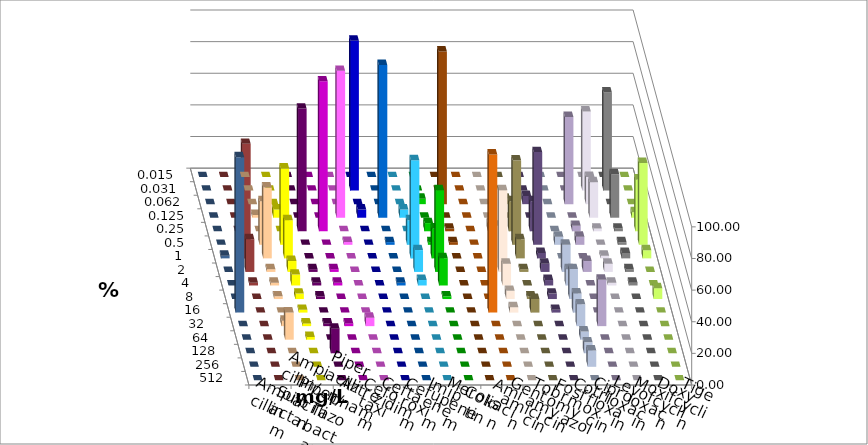
| Category | Ampicillin | Ampicillin/ Sulbactam | Piperacillin | Piperacillin/ Tazobactam | Aztreonam | Cefotaxim | Ceftazidim | Cefuroxim | Imipenem | Meropenem | Colistin | Amikacin | Gentamicin | Tobramycin | Fosfomycin | Cotrimoxazol | Ciprofloxacin | Levofloxacin | Moxifloxacin | Doxycyclin | Tigecyclin |
|---|---|---|---|---|---|---|---|---|---|---|---|---|---|---|---|---|---|---|---|---|---|
| 0.015 | 0 | 0 | 0 | 0 | 0 | 0 | 0 | 0 | 0 | 0 | 0 | 0 | 0 | 0 | 0 | 0 | 0 | 0 | 0 | 0 | 0 |
| 0.031 | 0 | 0 | 0 | 0 | 0 | 94.828 | 0 | 0 | 0 | 0 | 0 | 0 | 0 | 0 | 0 | 0 | 50 | 62.069 | 0 | 0 | 0 |
| 0.062 | 0 | 0 | 0 | 0 | 0 | 0 | 0 | 0 | 3.448 | 96.552 | 0 | 0 | 3.448 | 5.172 | 0 | 55.172 | 17.241 | 0 | 0 | 0 | 0 |
| 0.125 | 1.724 | 5.172 | 0 | 0 | 92.857 | 5.172 | 96.552 | 5.172 | 0 | 0 | 0 | 0 | 0 | 0 | 0 | 0 | 22.414 | 27.586 | 3.448 | 0 | 0 |
| 0.25 | 0 | 0 | 77.586 | 94.828 | 0 | 0 | 0 | 0 | 5.172 | 1.724 | 0 | 5.172 | 18.966 | 18.966 | 0 | 3.448 | 1.724 | 1.724 | 32.759 | 0 | 0 |
| 0.5 | 27.586 | 48.276 | 0 | 0 | 1.786 | 0 | 1.724 | 15.517 | 1.724 | 1.724 | 0 | 0 | 53.448 | 58.621 | 5.172 | 5.172 | 0 | 1.724 | 51.724 | 0 | 5.172 |
| 1.0 | 44.828 | 24.138 | 0 | 0 | 0 | 0 | 0 | 62.069 | 18.966 | 0 | 0 | 20.69 | 12.069 | 3.448 | 0 | 0 | 1.724 | 3.448 | 5.172 | 1.724 | 72.414 |
| 2.0 | 1.724 | 6.897 | 1.724 | 1.724 | 0 | 0 | 0 | 13.793 | 51.724 | 0 | 0 | 51.724 | 1.724 | 5.172 | 17.241 | 6.897 | 5.172 | 1.724 | 0 | 0 | 20.69 |
| 4.0 | 1.724 | 6.897 | 1.724 | 1.724 | 0 | 0 | 1.724 | 3.448 | 17.241 | 0 | 0 | 13.793 | 0 | 3.448 | 10.345 | 0 | 1.724 | 1.724 | 0 | 0 | 1.724 |
| 8.0 | 1.724 | 3.448 | 1.724 | 0 | 0 | 0 | 0 | 0 | 1.724 | 0 | 0 | 5.172 | 1.724 | 3.448 | 18.966 | 0 | 0 | 0 | 6.897 | 0 | 0 |
| 16.0 | 0 | 1.724 | 0 | 0 | 0 | 0 | 0 | 0 | 0 | 0 | 100 | 3.448 | 8.621 | 1.724 | 12.069 | 0 | 0 | 0 | 0 | 98.276 | 0 |
| 32.0 | 3.448 | 1.724 | 1.724 | 1.724 | 5.357 | 0 | 0 | 0 | 0 | 0 | 0 | 0 | 0 | 0 | 13.793 | 29.31 | 0 | 0 | 0 | 0 | 0 |
| 64.0 | 17.241 | 1.724 | 0 | 0 | 0 | 0 | 0 | 0 | 0 | 0 | 0 | 0 | 0 | 0 | 5.172 | 0 | 0 | 0 | 0 | 0 | 0 |
| 128.0 | 0 | 0 | 15.517 | 0 | 0 | 0 | 0 | 0 | 0 | 0 | 0 | 0 | 0 | 0 | 6.897 | 0 | 0 | 0 | 0 | 0 | 0 |
| 256.0 | 0 | 0 | 0 | 0 | 0 | 0 | 0 | 0 | 0 | 0 | 0 | 0 | 0 | 0 | 10.345 | 0 | 0 | 0 | 0 | 0 | 0 |
| 512.0 | 0 | 0 | 0 | 0 | 0 | 0 | 0 | 0 | 0 | 0 | 0 | 0 | 0 | 0 | 0 | 0 | 0 | 0 | 0 | 0 | 0 |